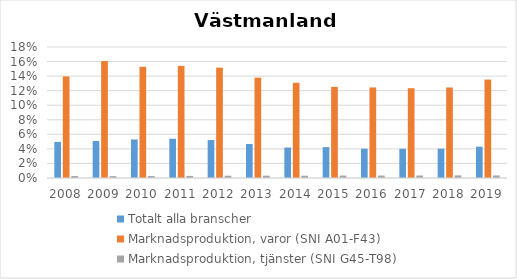
| Category | Totalt alla branscher | Marknadsproduktion, varor (SNI A01-F43) | Marknadsproduktion, tjänster (SNI G45-T98) |
|---|---|---|---|
| 2008 | 0.05 | 0.14 | 0.003 |
| 2009 | 0.051 | 0.161 | 0.003 |
| 2010 | 0.053 | 0.153 | 0.003 |
| 2011 | 0.054 | 0.154 | 0.003 |
| 2012 | 0.052 | 0.152 | 0.003 |
| 2013 | 0.047 | 0.138 | 0.003 |
| 2014 | 0.042 | 0.131 | 0.003 |
| 2015 | 0.042 | 0.125 | 0.003 |
| 2016 | 0.04 | 0.124 | 0.003 |
| 2017 | 0.04 | 0.123 | 0.003 |
| 2018 | 0.04 | 0.124 | 0.004 |
| 2019 | 0.043 | 0.135 | 0.004 |